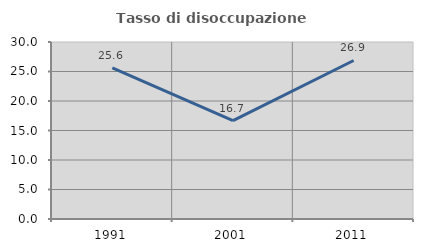
| Category | Tasso di disoccupazione giovanile  |
|---|---|
| 1991.0 | 25.6 |
| 2001.0 | 16.667 |
| 2011.0 | 26.866 |